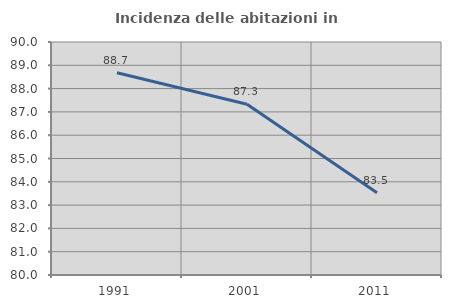
| Category | Incidenza delle abitazioni in proprietà  |
|---|---|
| 1991.0 | 88.681 |
| 2001.0 | 87.329 |
| 2011.0 | 83.532 |